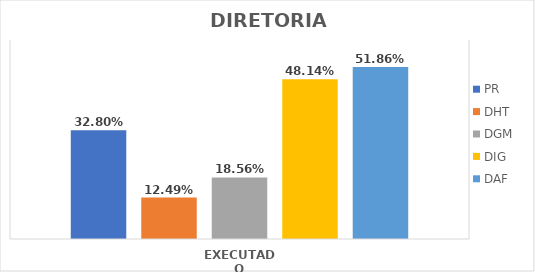
| Category | PR | DHT | DGM | DIG | DAF |
|---|---|---|---|---|---|
| EXECUTADO | 0.328 | 0.125 | 0.186 | 0.481 | 0.519 |